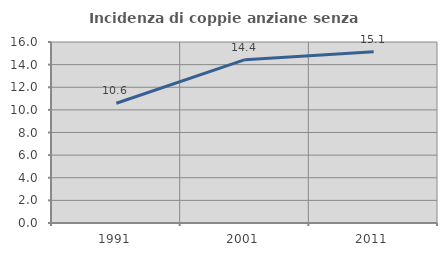
| Category | Incidenza di coppie anziane senza figli  |
|---|---|
| 1991.0 | 10.589 |
| 2001.0 | 14.439 |
| 2011.0 | 15.146 |